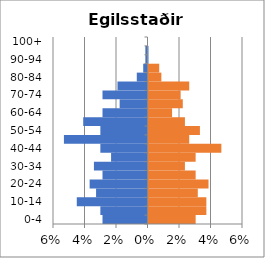
| Category | % Men | % Women |
|---|---|---|
| 0-4 | -0.029 | 0.03 |
| 5-9 | -0.03 | 0.037 |
| 10-14 | -0.045 | 0.037 |
| 15-19 | -0.033 | 0.031 |
| 20-24 | -0.037 | 0.038 |
| 25-29 | -0.029 | 0.03 |
| 30-34 | -0.034 | 0.023 |
| 35-39 | -0.023 | 0.03 |
| 40-44 | -0.03 | 0.046 |
| 45-49 | -0.053 | 0.026 |
| 50-54 | -0.03 | 0.033 |
| 55-59 | -0.041 | 0.023 |
| 60-64 | -0.029 | 0.015 |
| 65-69 | -0.018 | 0.022 |
| 70-74 | -0.029 | 0.02 |
| 75-79 | -0.019 | 0.026 |
| 80-84 | -0.007 | 0.008 |
| 85-89 | -0.003 | 0.007 |
| 90-94 | -0.001 | 0 |
| 95-99 | -0.001 | 0 |
| 100+ | 0 | 0 |